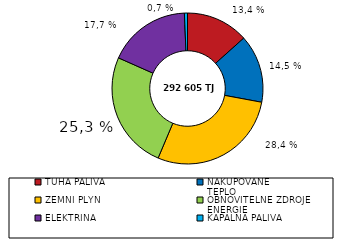
| Category | Series 0 |
|---|---|
| TUHÁ PALIVA | 39145 |
| NAKUPOVANÉ 
TEPLO | 42545 |
| ZEMNÍ PLYN | 83243 |
| OBNOVITELNÉ ZDROJE 
ENERGIE | 73977 |
| ELEKTŘINA | 51775 |
| KAPALNÁ PALIVA | 1919 |